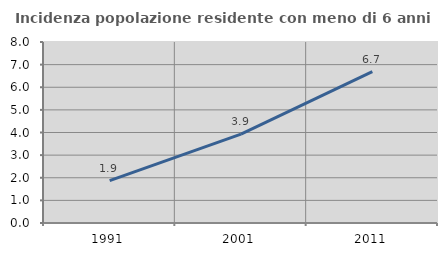
| Category | Incidenza popolazione residente con meno di 6 anni |
|---|---|
| 1991.0 | 1.869 |
| 2001.0 | 3.93 |
| 2011.0 | 6.693 |